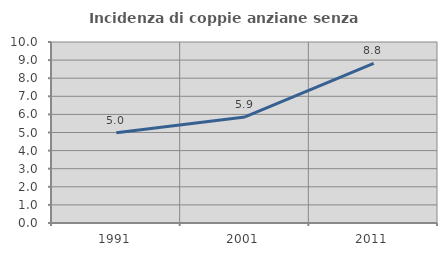
| Category | Incidenza di coppie anziane senza figli  |
|---|---|
| 1991.0 | 4.985 |
| 2001.0 | 5.857 |
| 2011.0 | 8.817 |